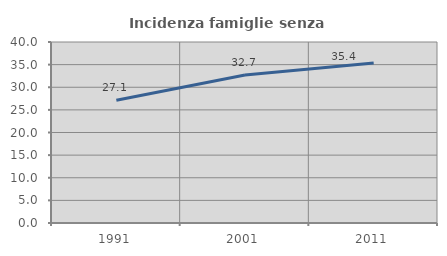
| Category | Incidenza famiglie senza nuclei |
|---|---|
| 1991.0 | 27.124 |
| 2001.0 | 32.698 |
| 2011.0 | 35.357 |